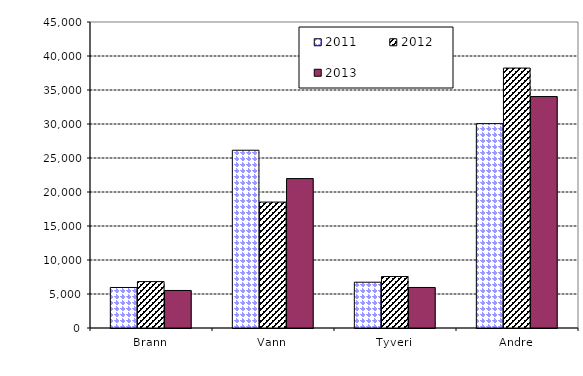
| Category | 2011 | 2012 | 2013 |
|---|---|---|---|
| Brann | 5959.258 | 6822.449 | 5520.445 |
| Vann | 26141.663 | 18517.393 | 21974.572 |
| Tyveri | 6732.46 | 7564.372 | 5958.397 |
| Andre | 30050.962 | 38225.991 | 34036.539 |